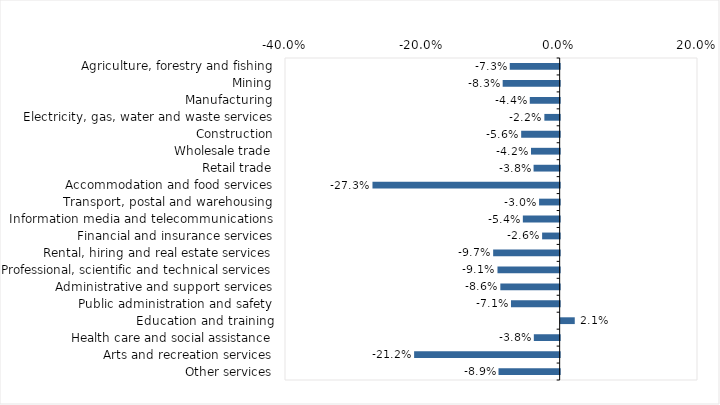
| Category | This week |
|---|---|
| Agriculture, forestry and fishing | -0.073 |
| Mining | -0.083 |
| Manufacturing | -0.044 |
| Electricity, gas, water and waste services | -0.022 |
| Construction | -0.056 |
| Wholesale trade | -0.042 |
| Retail trade | -0.038 |
| Accommodation and food services | -0.273 |
| Transport, postal and warehousing | -0.03 |
| Information media and telecommunications | -0.054 |
| Financial and insurance services | -0.026 |
| Rental, hiring and real estate services | -0.097 |
| Professional, scientific and technical services | -0.091 |
| Administrative and support services | -0.086 |
| Public administration and safety | -0.071 |
| Education and training | 0.021 |
| Health care and social assistance | -0.038 |
| Arts and recreation services | -0.212 |
| Other services | -0.089 |